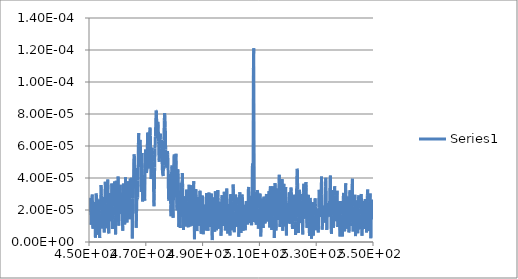
| Category | Series 0 |
|---|---|
| 450.0 | 0 |
| 450.125 | 0 |
| 450.25 | 0 |
| 450.375 | 0 |
| 450.5 | 0 |
| 450.625 | 0 |
| 450.75 | 0 |
| 450.875 | 0 |
| 451.0 | 0 |
| 451.125 | 0 |
| 451.25 | 0 |
| 451.375 | 0 |
| 451.5 | 0 |
| 451.625 | 0 |
| 451.75 | 0 |
| 451.875 | 0 |
| 452.0 | 0 |
| 452.125 | 0 |
| 452.25 | 0 |
| 452.375 | 0 |
| 452.5 | 0 |
| 452.625 | 0 |
| 452.75 | 0 |
| 452.875 | 0 |
| 453.0 | 0 |
| 453.125 | 0 |
| 453.25 | 0 |
| 453.375 | 0 |
| 453.5 | 0 |
| 453.625 | 0 |
| 453.75 | 0 |
| 453.875 | 0 |
| 454.0 | 0 |
| 454.125 | 0 |
| 454.25 | 0 |
| 454.375 | 0 |
| 454.5 | 0 |
| 454.625 | 0 |
| 454.75 | 0 |
| 454.875 | 0 |
| 455.0 | 0 |
| 455.125 | 0 |
| 455.25 | 0 |
| 455.375 | 0 |
| 455.5 | 0 |
| 455.625 | 0 |
| 455.75 | 0 |
| 455.875 | 0 |
| 456.0 | 0 |
| 456.125 | 0 |
| 456.25 | 0 |
| 456.375 | 0 |
| 456.5 | 0 |
| 456.625 | 0 |
| 456.75 | 0 |
| 456.875 | 0 |
| 457.0 | 0 |
| 457.125 | 0 |
| 457.25 | 0 |
| 457.375 | 0 |
| 457.5 | 0 |
| 457.625 | 0 |
| 457.75 | 0 |
| 457.875 | 0 |
| 458.0 | 0 |
| 458.125 | 0 |
| 458.25 | 0 |
| 458.375 | 0 |
| 458.5 | 0 |
| 458.625 | 0 |
| 458.75 | 0 |
| 458.875 | 0 |
| 459.0 | 0 |
| 459.125 | 0 |
| 459.25 | 0 |
| 459.375 | 0 |
| 459.5 | 0 |
| 459.625 | 0 |
| 459.75 | 0 |
| 459.875 | 0 |
| 460.0 | 0 |
| 460.125 | 0 |
| 460.25 | 0 |
| 460.375 | 0 |
| 460.5 | 0 |
| 460.625 | 0 |
| 460.75 | 0 |
| 460.875 | 0 |
| 461.0 | 0 |
| 461.125 | 0 |
| 461.25 | 0 |
| 461.375 | 0 |
| 461.5 | 0 |
| 461.625 | 0 |
| 461.75 | 0 |
| 461.875 | 0 |
| 462.0 | 0 |
| 462.125 | 0 |
| 462.25 | 0 |
| 462.375 | 0 |
| 462.5 | 0 |
| 462.625 | 0 |
| 462.75 | 0 |
| 462.875 | 0 |
| 463.0 | 0 |
| 463.125 | 0 |
| 463.25 | 0 |
| 463.375 | 0 |
| 463.5 | 0 |
| 463.625 | 0 |
| 463.75 | 0 |
| 463.875 | 0 |
| 464.0 | 0 |
| 464.125 | 0 |
| 464.25 | 0 |
| 464.375 | 0 |
| 464.5 | 0 |
| 464.625 | 0 |
| 464.75 | 0 |
| 464.875 | 0 |
| 465.0 | 0 |
| 465.125 | 0 |
| 465.25 | 0 |
| 465.375 | 0 |
| 465.5 | 0 |
| 465.625 | 0 |
| 465.75 | 0 |
| 465.875 | 0 |
| 466.0 | 0 |
| 466.125 | 0 |
| 466.25 | 0 |
| 466.375 | 0 |
| 466.5 | 0 |
| 466.625 | 0 |
| 466.75 | 0 |
| 466.875 | 0 |
| 467.0 | 0 |
| 467.125 | 0 |
| 467.25 | 0 |
| 467.375 | 0 |
| 467.5 | 0 |
| 467.625 | 0 |
| 467.75 | 0 |
| 467.875 | 0 |
| 468.0 | 0 |
| 468.125 | 0 |
| 468.25 | 0 |
| 468.375 | 0 |
| 468.5 | 0 |
| 468.625 | 0 |
| 468.75 | 0 |
| 468.875 | 0 |
| 469.0 | 0 |
| 469.125 | 0 |
| 469.25 | 0 |
| 469.375 | 0 |
| 469.5 | 0 |
| 469.625 | 0 |
| 469.75 | 0 |
| 469.875 | 0 |
| 470.0 | 0 |
| 470.125 | 0 |
| 470.25 | 0 |
| 470.375 | 0 |
| 470.5 | 0 |
| 470.625 | 0 |
| 470.75 | 0 |
| 470.875 | 0 |
| 471.0 | 0 |
| 471.125 | 0 |
| 471.25 | 0 |
| 471.375 | 0 |
| 471.5 | 0 |
| 471.625 | 0 |
| 471.75 | 0 |
| 471.875 | 0 |
| 472.0 | 0 |
| 472.125 | 0 |
| 472.25 | 0 |
| 472.375 | 0 |
| 472.5 | 0 |
| 472.625 | 0 |
| 472.75 | 0 |
| 472.875 | 0 |
| 473.0 | 0 |
| 473.125 | 0 |
| 473.25 | 0 |
| 473.375 | 0 |
| 473.5 | 0 |
| 473.625 | 0 |
| 473.75 | 0 |
| 473.875 | 0 |
| 474.0 | 0 |
| 474.125 | 0 |
| 474.25 | 0 |
| 474.375 | 0 |
| 474.5 | 0 |
| 474.625 | 0 |
| 474.75 | 0 |
| 474.875 | 0 |
| 475.0 | 0 |
| 475.125 | 0 |
| 475.25 | 0 |
| 475.375 | 0 |
| 475.5 | 0 |
| 475.625 | 0 |
| 475.75 | 0 |
| 475.875 | 0 |
| 476.0 | 0 |
| 476.125 | 0 |
| 476.25 | 0 |
| 476.375 | 0 |
| 476.5 | 0 |
| 476.625 | 0 |
| 476.75 | 0 |
| 476.875 | 0 |
| 477.0 | 0 |
| 477.125 | 0 |
| 477.25 | 0 |
| 477.375 | 0 |
| 477.5 | 0 |
| 477.625 | 0 |
| 477.75 | 0 |
| 477.875 | 0 |
| 478.0 | 0 |
| 478.125 | 0 |
| 478.25 | 0 |
| 478.375 | 0 |
| 478.5 | 0 |
| 478.625 | 0 |
| 478.75 | 0 |
| 478.875 | 0 |
| 479.0 | 0 |
| 479.125 | 0 |
| 479.25 | 0 |
| 479.375 | 0 |
| 479.5 | 0 |
| 479.625 | 0 |
| 479.75 | 0 |
| 479.875 | 0 |
| 480.0 | 0 |
| 480.125 | 0 |
| 480.25 | 0 |
| 480.375 | 0 |
| 480.5 | 0 |
| 480.625 | 0 |
| 480.75 | 0 |
| 480.875 | 0 |
| 481.0 | 0 |
| 481.125 | 0 |
| 481.25 | 0 |
| 481.375 | 0 |
| 481.5 | 0 |
| 481.625 | 0 |
| 481.75 | 0 |
| 481.875 | 0 |
| 482.0 | 0 |
| 482.125 | 0 |
| 482.25 | 0 |
| 482.375 | 0 |
| 482.5 | 0 |
| 482.625 | 0 |
| 482.75 | 0 |
| 482.875 | 0 |
| 483.0 | 0 |
| 483.125 | 0 |
| 483.25 | 0 |
| 483.375 | 0 |
| 483.5 | 0 |
| 483.625 | 0 |
| 483.75 | 0 |
| 483.875 | 0 |
| 484.0 | 0 |
| 484.125 | 0 |
| 484.25 | 0 |
| 484.375 | 0 |
| 484.5 | 0 |
| 484.625 | 0 |
| 484.75 | 0 |
| 484.875 | 0 |
| 485.0 | 0 |
| 485.125 | 0 |
| 485.25 | 0 |
| 485.375 | 0 |
| 485.5 | 0 |
| 485.625 | 0 |
| 485.75 | 0 |
| 485.875 | 0 |
| 486.0 | 0 |
| 486.125 | 0 |
| 486.25 | 0 |
| 486.375 | 0 |
| 486.5 | 0 |
| 486.625 | 0 |
| 486.75 | 0 |
| 486.875 | 0 |
| 487.0 | 0 |
| 487.125 | 0 |
| 487.25 | 0 |
| 487.375 | 0 |
| 487.5 | 0 |
| 487.625 | 0 |
| 487.75 | 0 |
| 487.875 | 0 |
| 488.0 | 0 |
| 488.125 | 0 |
| 488.25 | 0 |
| 488.375 | 0 |
| 488.5 | 0 |
| 488.625 | 0 |
| 488.75 | 0 |
| 488.875 | 0 |
| 489.0 | 0 |
| 489.125 | 0 |
| 489.25 | 0 |
| 489.375 | 0 |
| 489.5 | 0 |
| 489.625 | 0 |
| 489.75 | 0 |
| 489.875 | 0 |
| 490.0 | 0 |
| 490.125 | 0 |
| 490.25 | 0 |
| 490.375 | 0 |
| 490.5 | 0 |
| 490.625 | 0 |
| 490.75 | 0 |
| 490.875 | 0 |
| 491.0 | 0 |
| 491.125 | 0 |
| 491.25 | 0 |
| 491.375 | 0 |
| 491.5 | 0 |
| 491.625 | 0 |
| 491.75 | 0 |
| 491.875 | 0 |
| 492.0 | 0 |
| 492.125 | 0 |
| 492.25 | 0 |
| 492.375 | 0 |
| 492.5 | 0 |
| 492.625 | 0 |
| 492.75 | 0 |
| 492.875 | 0 |
| 493.0 | 0 |
| 493.125 | 0 |
| 493.25 | 0 |
| 493.375 | 0 |
| 493.5 | 0 |
| 493.625 | 0 |
| 493.75 | 0 |
| 493.875 | 0 |
| 494.0 | 0 |
| 494.125 | 0 |
| 494.25 | 0 |
| 494.375 | 0 |
| 494.5 | 0 |
| 494.625 | 0 |
| 494.75 | 0 |
| 494.875 | 0 |
| 495.0 | 0 |
| 495.125 | 0 |
| 495.25 | 0 |
| 495.375 | 0 |
| 495.5 | 0 |
| 495.625 | 0 |
| 495.75 | 0 |
| 495.875 | 0 |
| 496.0 | 0 |
| 496.125 | 0 |
| 496.25 | 0 |
| 496.375 | 0 |
| 496.5 | 0 |
| 496.625 | 0 |
| 496.75 | 0 |
| 496.875 | 0 |
| 497.0 | 0 |
| 497.125 | 0 |
| 497.25 | 0 |
| 497.375 | 0 |
| 497.5 | 0 |
| 497.625 | 0 |
| 497.75 | 0 |
| 497.875 | 0 |
| 498.0 | 0 |
| 498.125 | 0 |
| 498.25 | 0 |
| 498.375 | 0 |
| 498.5 | 0 |
| 498.625 | 0 |
| 498.75 | 0 |
| 498.875 | 0 |
| 499.0 | 0 |
| 499.125 | 0 |
| 499.25 | 0 |
| 499.375 | 0 |
| 499.5 | 0 |
| 499.625 | 0 |
| 499.75 | 0 |
| 499.875 | 0 |
| 500.0 | 0 |
| 500.125 | 0 |
| 500.25 | 0 |
| 500.375 | 0 |
| 500.5 | 0 |
| 500.625 | 0 |
| 500.75 | 0 |
| 500.875 | 0 |
| 501.0 | 0 |
| 501.125 | 0 |
| 501.25 | 0 |
| 501.375 | 0 |
| 501.5 | 0 |
| 501.625 | 0 |
| 501.75 | 0 |
| 501.875 | 0 |
| 502.0 | 0 |
| 502.125 | 0 |
| 502.25 | 0 |
| 502.375 | 0 |
| 502.5 | 0 |
| 502.625 | 0 |
| 502.75 | 0 |
| 502.875 | 0 |
| 503.0 | 0 |
| 503.125 | 0 |
| 503.25 | 0 |
| 503.375 | 0 |
| 503.5 | 0 |
| 503.625 | 0 |
| 503.75 | 0 |
| 503.875 | 0 |
| 504.0 | 0 |
| 504.125 | 0 |
| 504.25 | 0 |
| 504.375 | 0 |
| 504.5 | 0 |
| 504.625 | 0 |
| 504.75 | 0 |
| 504.875 | 0 |
| 505.0 | 0 |
| 505.125 | 0 |
| 505.25 | 0 |
| 505.375 | 0 |
| 505.5 | 0 |
| 505.625 | 0 |
| 505.75 | 0 |
| 505.875 | 0 |
| 506.0 | 0 |
| 506.125 | 0 |
| 506.25 | 0 |
| 506.375 | 0 |
| 506.5 | 0 |
| 506.625 | 0 |
| 506.75 | 0 |
| 506.875 | 0 |
| 507.0 | 0 |
| 507.125 | 0 |
| 507.25 | 0 |
| 507.375 | 0 |
| 507.5 | 0 |
| 507.625 | 0 |
| 507.75 | 0 |
| 507.875 | 0 |
| 508.0 | 0 |
| 508.125 | 0 |
| 508.25 | 0 |
| 508.375 | 0 |
| 508.5 | 0 |
| 508.625 | 0 |
| 508.75 | 0 |
| 508.875 | 0 |
| 509.0 | 0 |
| 509.125 | 0 |
| 509.25 | 0 |
| 509.375 | 0 |
| 509.5 | 0 |
| 509.625 | 0 |
| 509.75 | 0 |
| 509.875 | 0 |
| 510.0 | 0 |
| 510.125 | 0 |
| 510.25 | 0 |
| 510.375 | 0 |
| 510.5 | 0 |
| 510.625 | 0 |
| 510.75 | 0 |
| 510.875 | 0 |
| 511.0 | 0 |
| 511.125 | 0 |
| 511.25 | 0 |
| 511.375 | 0 |
| 511.5 | 0 |
| 511.625 | 0 |
| 511.75 | 0 |
| 511.875 | 0 |
| 512.0 | 0 |
| 512.125 | 0 |
| 512.25 | 0 |
| 512.375 | 0 |
| 512.5 | 0 |
| 512.625 | 0 |
| 512.75 | 0 |
| 512.875 | 0 |
| 513.0 | 0 |
| 513.125 | 0 |
| 513.25 | 0 |
| 513.375 | 0 |
| 513.5 | 0 |
| 513.625 | 0 |
| 513.75 | 0 |
| 513.875 | 0 |
| 514.0 | 0 |
| 514.125 | 0 |
| 514.25 | 0 |
| 514.375 | 0 |
| 514.5 | 0 |
| 514.625 | 0 |
| 514.75 | 0 |
| 514.875 | 0 |
| 515.0 | 0 |
| 515.125 | 0 |
| 515.25 | 0 |
| 515.375 | 0 |
| 515.5 | 0 |
| 515.625 | 0 |
| 515.75 | 0 |
| 515.875 | 0 |
| 516.0 | 0 |
| 516.125 | 0 |
| 516.25 | 0 |
| 516.375 | 0 |
| 516.5 | 0 |
| 516.625 | 0 |
| 516.75 | 0 |
| 516.875 | 0 |
| 517.0 | 0 |
| 517.125 | 0 |
| 517.25 | 0 |
| 517.375 | 0 |
| 517.5 | 0 |
| 517.625 | 0 |
| 517.75 | 0 |
| 517.875 | 0 |
| 518.0 | 0 |
| 518.125 | 0 |
| 518.25 | 0 |
| 518.375 | 0 |
| 518.5 | 0 |
| 518.625 | 0 |
| 518.75 | 0 |
| 518.875 | 0 |
| 519.0 | 0 |
| 519.125 | 0 |
| 519.25 | 0 |
| 519.375 | 0 |
| 519.5 | 0 |
| 519.625 | 0 |
| 519.75 | 0 |
| 519.875 | 0 |
| 520.0 | 0 |
| 520.125 | 0 |
| 520.25 | 0 |
| 520.375 | 0 |
| 520.5 | 0 |
| 520.625 | 0 |
| 520.75 | 0 |
| 520.875 | 0 |
| 521.0 | 0 |
| 521.125 | 0 |
| 521.25 | 0 |
| 521.375 | 0 |
| 521.5 | 0 |
| 521.625 | 0 |
| 521.75 | 0 |
| 521.875 | 0 |
| 522.0 | 0 |
| 522.125 | 0 |
| 522.25 | 0 |
| 522.375 | 0 |
| 522.5 | 0 |
| 522.625 | 0 |
| 522.75 | 0 |
| 522.875 | 0 |
| 523.0 | 0 |
| 523.125 | 0 |
| 523.25 | 0 |
| 523.375 | 0 |
| 523.5 | 0 |
| 523.625 | 0 |
| 523.75 | 0 |
| 523.875 | 0 |
| 524.0 | 0 |
| 524.125 | 0 |
| 524.25 | 0 |
| 524.375 | 0 |
| 524.5 | 0 |
| 524.625 | 0 |
| 524.75 | 0 |
| 524.875 | 0 |
| 525.0 | 0 |
| 525.125 | 0 |
| 525.25 | 0 |
| 525.375 | 0 |
| 525.5 | 0 |
| 525.625 | 0 |
| 525.75 | 0 |
| 525.875 | 0 |
| 526.0 | 0 |
| 526.125 | 0 |
| 526.25 | 0 |
| 526.375 | 0 |
| 526.5 | 0 |
| 526.625 | 0 |
| 526.75 | 0 |
| 526.875 | 0 |
| 527.0 | 0 |
| 527.125 | 0 |
| 527.25 | 0 |
| 527.375 | 0 |
| 527.5 | 0 |
| 527.625 | 0 |
| 527.75 | 0 |
| 527.875 | 0 |
| 528.0 | 0 |
| 528.125 | 0 |
| 528.25 | 0 |
| 528.375 | 0 |
| 528.5 | 0 |
| 528.625 | 0 |
| 528.75 | 0 |
| 528.875 | 0 |
| 529.0 | 0 |
| 529.125 | 0 |
| 529.25 | 0 |
| 529.375 | 0 |
| 529.5 | 0 |
| 529.625 | 0 |
| 529.75 | 0 |
| 529.875 | 0 |
| 530.0 | 0 |
| 530.125 | 0 |
| 530.25 | 0 |
| 530.375 | 0 |
| 530.5 | 0 |
| 530.625 | 0 |
| 530.75 | 0 |
| 530.875 | 0 |
| 531.0 | 0 |
| 531.125 | 0 |
| 531.25 | 0 |
| 531.375 | 0 |
| 531.5 | 0 |
| 531.625 | 0 |
| 531.75 | 0 |
| 531.875 | 0 |
| 532.0 | 0 |
| 532.125 | 0 |
| 532.25 | 0 |
| 532.375 | 0 |
| 532.5 | 0 |
| 532.625 | 0 |
| 532.75 | 0 |
| 532.875 | 0 |
| 533.0 | 0 |
| 533.125 | 0 |
| 533.25 | 0 |
| 533.375 | 0 |
| 533.5 | 0 |
| 533.625 | 0 |
| 533.75 | 0 |
| 533.875 | 0 |
| 534.0 | 0 |
| 534.125 | 0 |
| 534.25 | 0 |
| 534.375 | 0 |
| 534.5 | 0 |
| 534.625 | 0 |
| 534.75 | 0 |
| 534.875 | 0 |
| 535.0 | 0 |
| 535.125 | 0 |
| 535.25 | 0 |
| 535.375 | 0 |
| 535.5 | 0 |
| 535.625 | 0 |
| 535.75 | 0 |
| 535.875 | 0 |
| 536.0 | 0 |
| 536.125 | 0 |
| 536.25 | 0 |
| 536.375 | 0 |
| 536.5 | 0 |
| 536.625 | 0 |
| 536.75 | 0 |
| 536.875 | 0 |
| 537.0 | 0 |
| 537.125 | 0 |
| 537.25 | 0 |
| 537.375 | 0 |
| 537.5 | 0 |
| 537.625 | 0 |
| 537.75 | 0 |
| 537.875 | 0 |
| 538.0 | 0 |
| 538.125 | 0 |
| 538.25 | 0 |
| 538.375 | 0 |
| 538.5 | 0 |
| 538.625 | 0 |
| 538.75 | 0 |
| 538.875 | 0 |
| 539.0 | 0 |
| 539.125 | 0 |
| 539.25 | 0 |
| 539.375 | 0 |
| 539.5 | 0 |
| 539.625 | 0 |
| 539.75 | 0 |
| 539.875 | 0 |
| 540.0 | 0 |
| 540.125 | 0 |
| 540.25 | 0 |
| 540.375 | 0 |
| 540.5 | 0 |
| 540.625 | 0 |
| 540.75 | 0 |
| 540.875 | 0 |
| 541.0 | 0 |
| 541.125 | 0 |
| 541.25 | 0 |
| 541.375 | 0 |
| 541.5 | 0 |
| 541.625 | 0 |
| 541.75 | 0 |
| 541.875 | 0 |
| 542.0 | 0 |
| 542.125 | 0 |
| 542.25 | 0 |
| 542.375 | 0 |
| 542.5 | 0 |
| 542.625 | 0 |
| 542.75 | 0 |
| 542.875 | 0 |
| 543.0 | 0 |
| 543.125 | 0 |
| 543.25 | 0 |
| 543.375 | 0 |
| 543.5 | 0 |
| 543.625 | 0 |
| 543.75 | 0 |
| 543.875 | 0 |
| 544.0 | 0 |
| 544.125 | 0 |
| 544.25 | 0 |
| 544.375 | 0 |
| 544.5 | 0 |
| 544.625 | 0 |
| 544.75 | 0 |
| 544.875 | 0 |
| 545.0 | 0 |
| 545.125 | 0 |
| 545.25 | 0 |
| 545.375 | 0 |
| 545.5 | 0 |
| 545.625 | 0 |
| 545.75 | 0 |
| 545.875 | 0 |
| 546.0 | 0 |
| 546.125 | 0 |
| 546.25 | 0 |
| 546.375 | 0 |
| 546.5 | 0 |
| 546.625 | 0 |
| 546.75 | 0 |
| 546.875 | 0 |
| 547.0 | 0 |
| 547.125 | 0 |
| 547.25 | 0 |
| 547.375 | 0 |
| 547.5 | 0 |
| 547.625 | 0 |
| 547.75 | 0 |
| 547.875 | 0 |
| 548.0 | 0 |
| 548.125 | 0 |
| 548.25 | 0 |
| 548.375 | 0 |
| 548.5 | 0 |
| 548.625 | 0 |
| 548.75 | 0 |
| 548.875 | 0 |
| 549.0 | 0 |
| 549.125 | 0 |
| 549.25 | 0 |
| 549.375 | 0 |
| 549.5 | 0 |
| 549.625 | 0 |
| 549.75 | 0 |
| 549.875 | 0 |
| 550.0 | 0 |